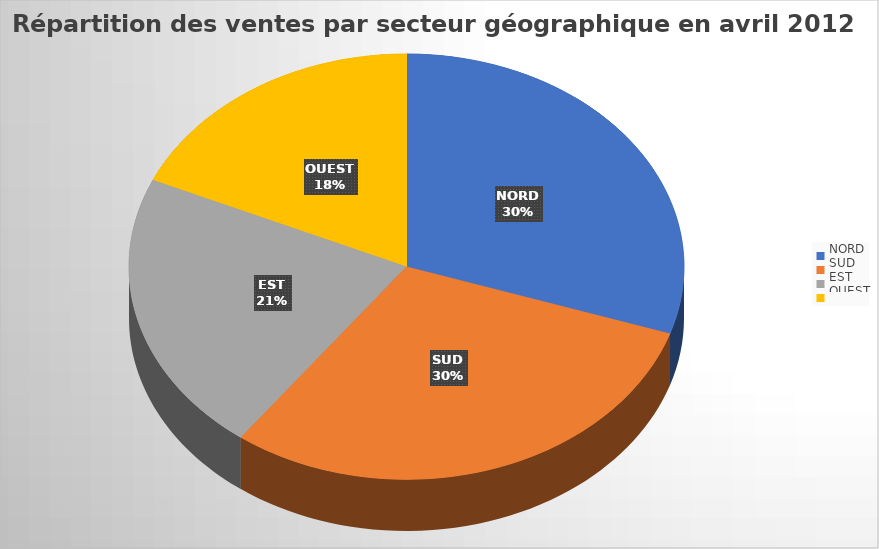
| Category | VENTES
TOTALES |
|---|---|
| NORD | 133 |
| SUD | 133 |
| EST | 95 |
| OUEST | 81 |